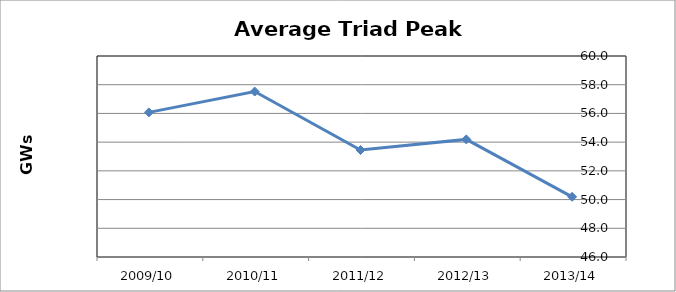
| Category | Demand (GW) |
|---|---|
| 2013/14 | 50.191 |
| 2012/13 | 54.192 |
| 2011/12 | 53.452 |
| 2010/11 | 57.524 |
| 2009/10 | 56.073 |